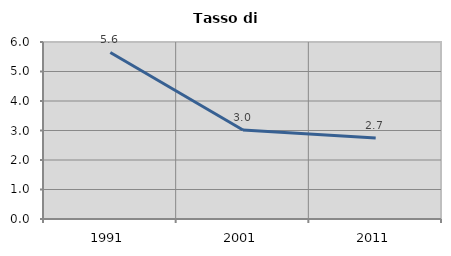
| Category | Tasso di disoccupazione   |
|---|---|
| 1991.0 | 5.645 |
| 2001.0 | 3.019 |
| 2011.0 | 2.744 |